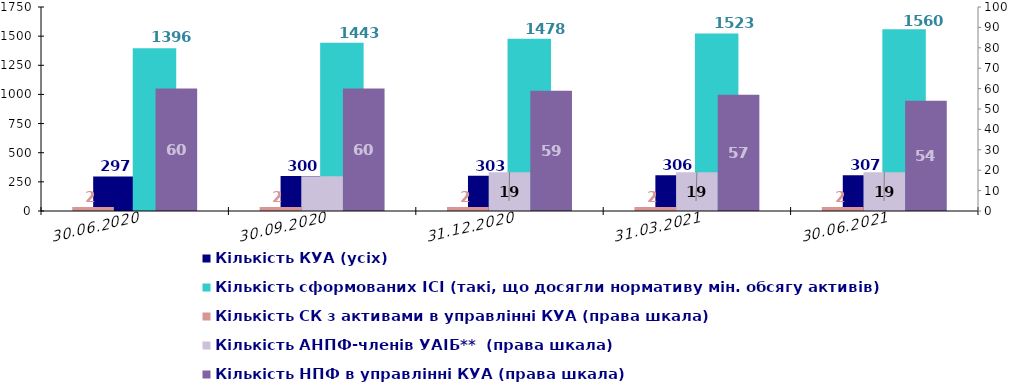
| Category | Кількість КУА (усіх) | Кількість КУА з ІСІ в управлінні | Кількість ІСІ в управлінні  | Кількість сформованих ІСІ (такі, що досягли нормативу мін. обсягу активів)  |
|---|---|---|---|---|
| 30.06.2020 | 297 |  |  | 1396 |
| 30.09.2020 | 300 |  |  | 1443 |
| 31.12.2020 | 303 |  |  | 1478 |
| 31.03.2021 | 306 |  |  | 1523 |
| 30.06.2021 | 307 |  |  | 1560 |